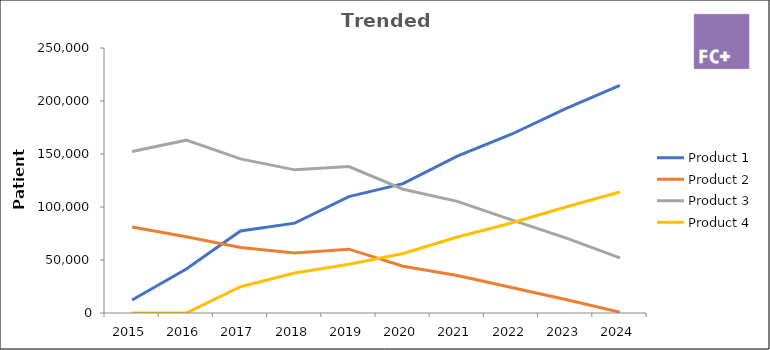
| Category | Product 1 | Product 2 | Product 3 | Product 4 |
|---|---|---|---|---|
| 2015.0 | 12288.113 | 81101.543 | 152372.595 | 0 |
| 2016.0 | 41455.252 | 71855.77 | 163057.323 | 0 |
| 2017.0 | 77342.437 | 61873.95 | 145403.782 | 24749.58 |
| 2018.0 | 84796.97 | 56531.313 | 135047.026 | 37687.542 |
| 2019.0 | 109793.717 | 60209.457 | 138127.579 | 46042.526 |
| 2020.0 | 122075.933 | 44082.976 | 116763.369 | 56177.536 |
| 2021.0 | 148005.049 | 35319.387 | 105357.49 | 71719.979 |
| 2022.0 | 168643.346 | 24126.721 | 87855.385 | 84930.934 |
| 2023.0 | 192724.025 | 12798.08 | 70891.324 | 100000.682 |
| 2024.0 | 214740.548 | 763.296 | 52031.329 | 114112.72 |